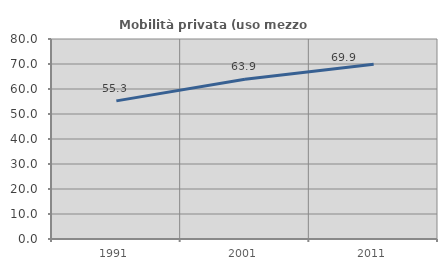
| Category | Mobilità privata (uso mezzo privato) |
|---|---|
| 1991.0 | 55.254 |
| 2001.0 | 63.919 |
| 2011.0 | 69.885 |